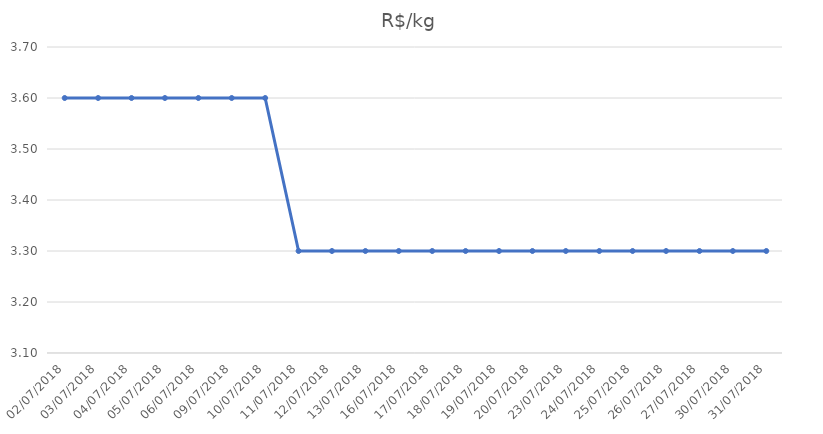
| Category | R$/kg |
|---|---|
| 02/07/2018 | 3.6 |
| 03/07/2018 | 3.6 |
| 04/07/2018 | 3.6 |
| 05/07/2018 | 3.6 |
| 06/07/2018 | 3.6 |
| 09/07/2018 | 3.6 |
| 10/07/2018 | 3.6 |
| 11/07/2018 | 3.3 |
| 12/07/2018 | 3.3 |
| 13/07/2018 | 3.3 |
| 16/07/2018 | 3.3 |
| 17/07/2018 | 3.3 |
| 18/07/2018 | 3.3 |
| 19/07/2018 | 3.3 |
| 20/07/2018 | 3.3 |
| 23/07/2018 | 3.3 |
| 24/07/2018 | 3.3 |
| 25/07/2018 | 3.3 |
| 26/07/2018 | 3.3 |
| 27/07/2018 | 3.3 |
| 30/07/2018 | 3.3 |
| 31/07/2018 | 3.3 |